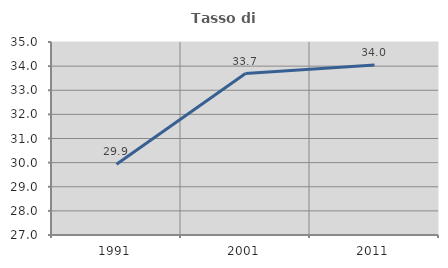
| Category | Tasso di occupazione   |
|---|---|
| 1991.0 | 29.933 |
| 2001.0 | 33.69 |
| 2011.0 | 34.042 |